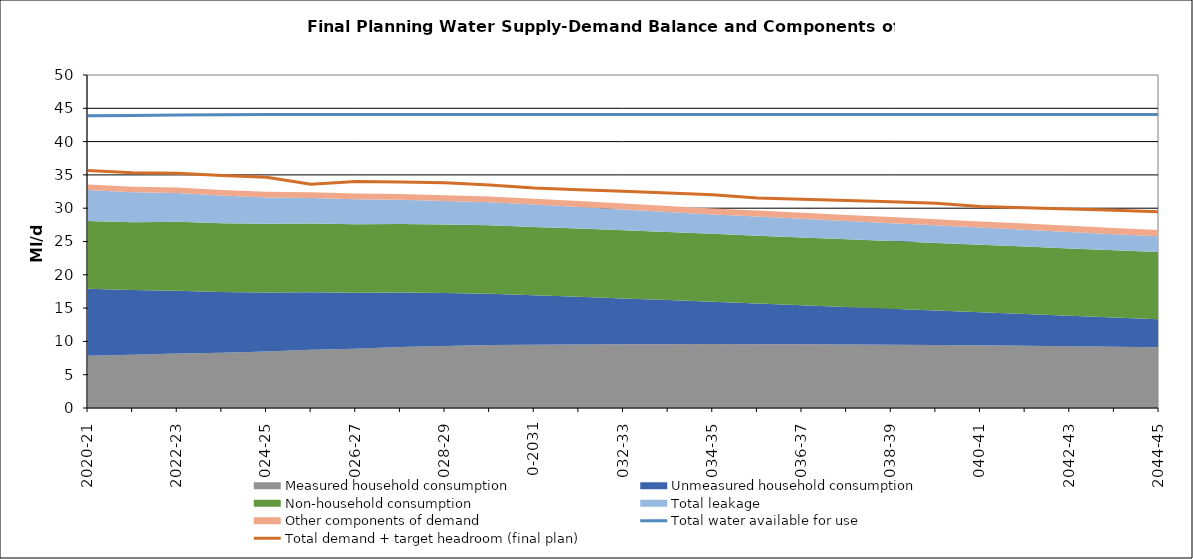
| Category | Total water available for use | Total demand + target headroom (final plan) |
|---|---|---|
| 0 | 43.886 | 35.651 |
| 1 | 43.936 | 35.324 |
| 2 | 43.986 | 35.256 |
| 3 | 44.043 | 34.915 |
| 4 | 44.073 | 34.654 |
| 5 | 44.073 | 33.583 |
| 6 | 44.073 | 34.002 |
| 7 | 44.073 | 33.952 |
| 8 | 44.073 | 33.811 |
| 9 | 44.073 | 33.5 |
| 10 | 44.073 | 33.025 |
| 11 | 44.073 | 32.763 |
| 12 | 44.073 | 32.53 |
| 13 | 44.073 | 32.281 |
| 14 | 44.073 | 32.028 |
| 15 | 44.073 | 31.529 |
| 16 | 44.073 | 31.354 |
| 17 | 44.073 | 31.149 |
| 18 | 44.073 | 30.971 |
| 19 | 44.073 | 30.749 |
| 20 | 44.073 | 30.266 |
| 21 | 44.073 | 30.07 |
| 22 | 44.073 | 29.888 |
| 23 | 44.073 | 29.682 |
| 24 | 44.073 | 29.479 |